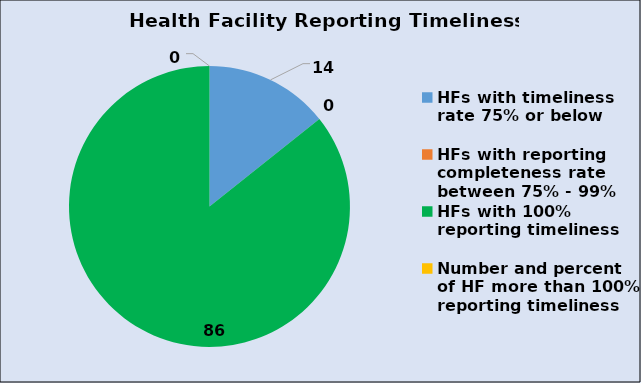
| Category | Percentage  |
|---|---|
| HFs with timeliness rate 75% or below   | 14.286 |
| HFs with reporting completeness rate between 75% - 99% | 0 |
| HFs with 100% reporting timeliness | 85.714 |
| Number and percent of HF more than 100% reporting timeliness | 0 |